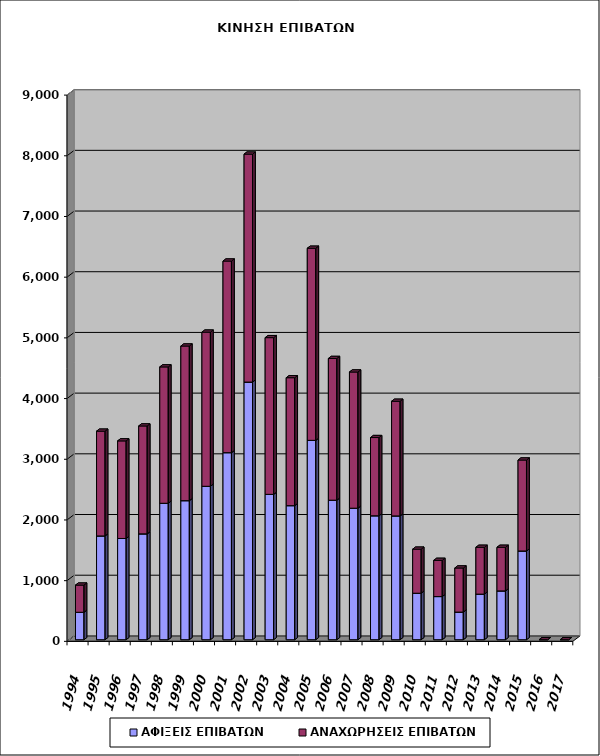
| Category | ΑΦΙΞΕΙΣ ΕΠΙΒΑΤΩΝ | ΑΝΑΧΩΡΗΣΕΙΣ ΕΠΙΒΑΤΩΝ |
|---|---|---|
| 1994.0 | 452 | 448 |
| 1995.0 | 1710 | 1726 |
| 1996.0 | 1668 | 1608 |
| 1997.0 | 1744 | 1778 |
| 1998.0 | 2248 | 2247 |
| 1999.0 | 2291 | 2548 |
| 2000.0 | 2528 | 2540 |
| 2001.0 | 3082 | 3157 |
| 2002.0 | 4245 | 3756 |
| 2003.0 | 2395 | 2582 |
| 2004.0 | 2209 | 2108 |
| 2005.0 | 3285 | 3165 |
| 2006.0 | 2299 | 2335 |
| 2007.0 | 2167 | 2244 |
| 2008.0 | 2042 | 1289 |
| 2009.0 | 2040 | 1889 |
| 2010.0 | 766 | 726 |
| 2011.0 | 711 | 597 |
| 2012.0 | 455 | 727 |
| 2013.0 | 751 | 772 |
| 2014.0 | 804 | 719 |
| 2015.0 | 1462 | 1499 |
| 2016.0 | 0 | 0 |
| 2017.0 | 0 | 0 |